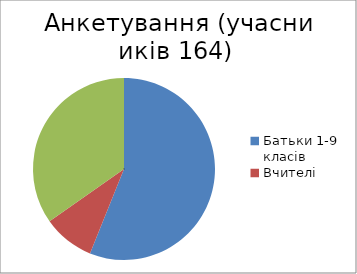
| Category | Series 2 | Батьки 1-9 класів Вчителі Учні 4-9 класи | 92 15 57 |
|---|---|---|---|
| Батьки 1-9 класів | 92 |  |  |
| Вчителі | 15 |  |  |
| Учні 4-9 класи | 57 |  |  |